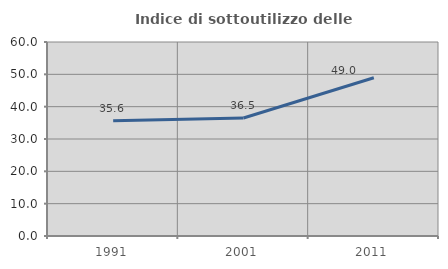
| Category | Indice di sottoutilizzo delle abitazioni  |
|---|---|
| 1991.0 | 35.62 |
| 2001.0 | 36.504 |
| 2011.0 | 48.953 |